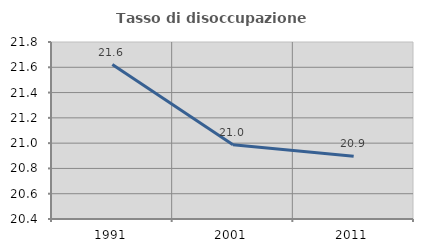
| Category | Tasso di disoccupazione giovanile  |
|---|---|
| 1991.0 | 21.622 |
| 2001.0 | 20.988 |
| 2011.0 | 20.896 |